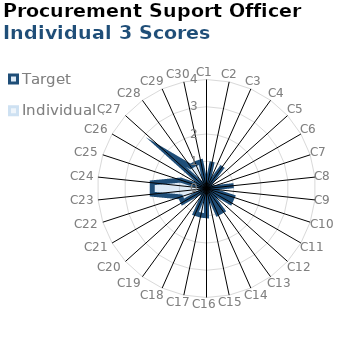
| Category | Target | Individual 3 |
|---|---|---|
| C1 | 0 | 0 |
| C2 | 1 | 0 |
| C3 | 0 | 0 |
| C4 | 1 | 0 |
| C5 | 0 | 0 |
| C6 | 0 | 0 |
| C7 | 0 | 0 |
| C8 | 1 | 0 |
| C9 | 0 | 0 |
| C10 | 1 | 0 |
| C11 | 1 | 0 |
| C12 | 0 | 0 |
| C13 | 1 | 0 |
| C14 | 1 | 0 |
| C15 | 0 | 0 |
| C16 | 1 | 0 |
| C17 | 1 | 0 |
| C18 | 1 | 0 |
| C19 | 0 | 0 |
| C20 | 0 | 0 |
| C21 | 1 | 0 |
| C22 | 1 | 0 |
| C23 | 2 | 0 |
| C24 | 2 | 0 |
| C25 | 1 | 0 |
| C26 | 0 | 0 |
| C27 | 2 | 0 |
| C28 | 1 | 0 |
| C29 | 1 | 0 |
| C30 | 1 | 0 |